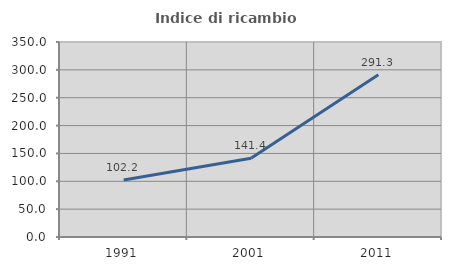
| Category | Indice di ricambio occupazionale  |
|---|---|
| 1991.0 | 102.191 |
| 2001.0 | 141.438 |
| 2011.0 | 291.253 |